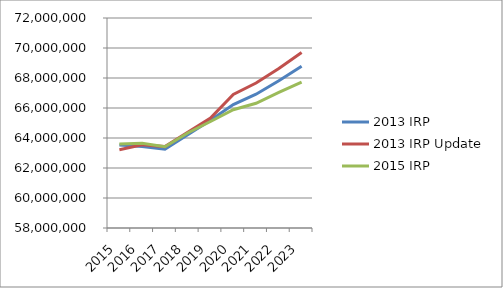
| Category | 2013 IRP | 2013 IRP Update | 2015 IRP |
|---|---|---|---|
| 2015.0 | 63527997.729 | 63220770 | 63594000 |
| 2016.0 | 63431505.436 | 63543020 | 63644160 |
| 2017.0 | 63246310.758 | 63426040 | 63414410 |
| 2018.0 | 64219328.156 | 64379000 | 64335670 |
| 2019.0 | 65183187.172 | 65325360 | 65099110 |
| 2020.0 | 66226672.131 | 66909690 | 65882150 |
| 2021.0 | 66917768.933 | 67665770 | 66317890 |
| 2022.0 | 67814244.259 | 68636570 | 67038440 |
| 2023.0 | 68781288.094 | 69701020 | 67731040 |